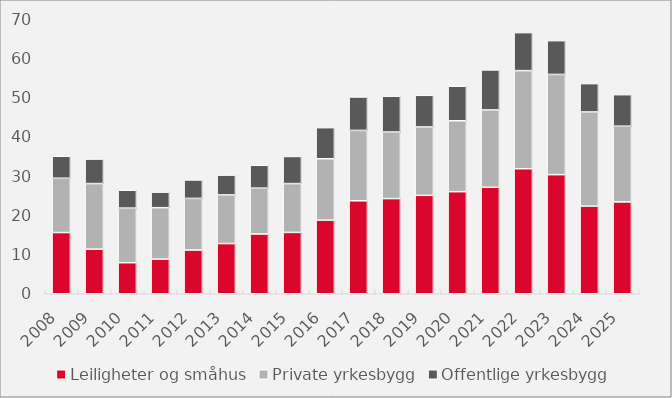
| Category | Leiligheter og småhus | Private yrkesbygg | Offentlige yrkesbygg |
|---|---|---|---|
| 2008.0 | 15.582 | 13.815 | 5.602 |
| 2009.0 | 11.362 | 16.687 | 6.238 |
| 2010.0 | 7.906 | 13.892 | 4.557 |
| 2011.0 | 8.828 | 13.081 | 3.953 |
| 2012.0 | 11.128 | 13.142 | 4.699 |
| 2013.0 | 12.776 | 12.379 | 5.048 |
| 2014.0 | 15.214 | 11.664 | 5.825 |
| 2015.0 | 15.612 | 12.431 | 6.905 |
| 2016.0 | 18.736 | 15.628 | 7.918 |
| 2017.0 | 23.665 | 17.912 | 8.518 |
| 2018.0 | 24.225 | 16.942 | 9.126 |
| 2019.0 | 25.052 | 17.401 | 8.061 |
| 2020.0 | 25.986 | 18.054 | 8.78 |
| 2021.0 | 27.1 | 19.691 | 10.19 |
| 2022.0 | 31.827 | 24.972 | 9.671 |
| 2023.0 | 30.323 | 25.499 | 8.605 |
| 2024.0 | 22.304 | 23.969 | 7.22 |
| 2025.0 | 23.386 | 19.264 | 8.029 |